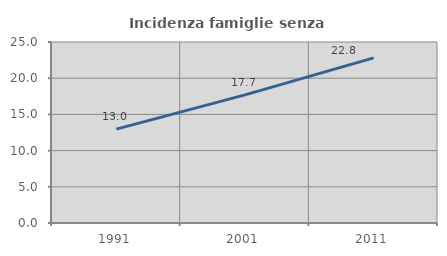
| Category | Incidenza famiglie senza nuclei |
|---|---|
| 1991.0 | 12.973 |
| 2001.0 | 17.695 |
| 2011.0 | 22.814 |